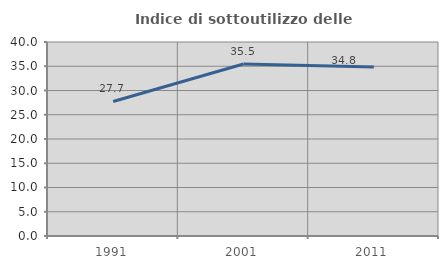
| Category | Indice di sottoutilizzo delle abitazioni  |
|---|---|
| 1991.0 | 27.739 |
| 2001.0 | 35.466 |
| 2011.0 | 34.842 |